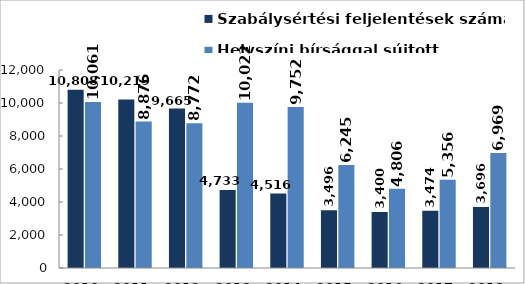
| Category | Szabálysértési feljelentések száma | Helyszíni bírsággal sújtott személyek száma (fő) |
|---|---|---|
| 2010. év | 10808 | 10061 |
| 2011. év | 10219 | 8876 |
| 2012. év | 9665 | 8772 |
| 2013. év | 4733 | 10022 |
| 2014. év | 4516 | 9752 |
| 2015. év | 3496 | 6245 |
| 2016. év | 3400 | 4806 |
| 2017. év | 3474 | 5356 |
| 2018. év | 3696 | 6969 |